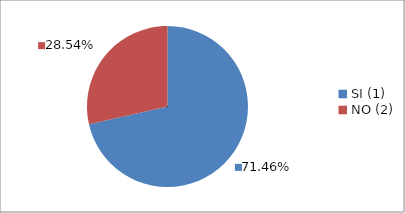
| Category | Series 0 |
|---|---|
| SI (1) | 0.715 |
| NO (2) | 0.285 |